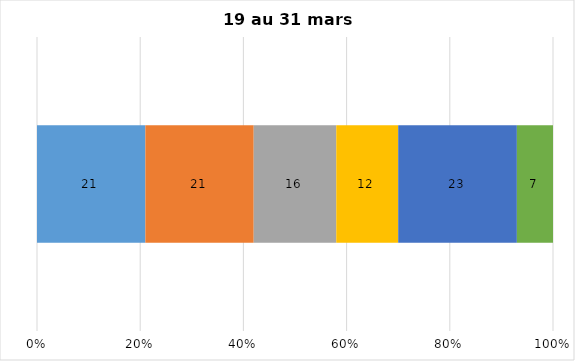
| Category | Plusieurs fois par jour | Une fois par jour | Quelques fois par semaine   | Une fois par semaine ou moins   |  Jamais   |  Je n’utilise pas les médias sociaux |
|---|---|---|---|---|---|---|
| 0 | 21 | 21 | 16 | 12 | 23 | 7 |